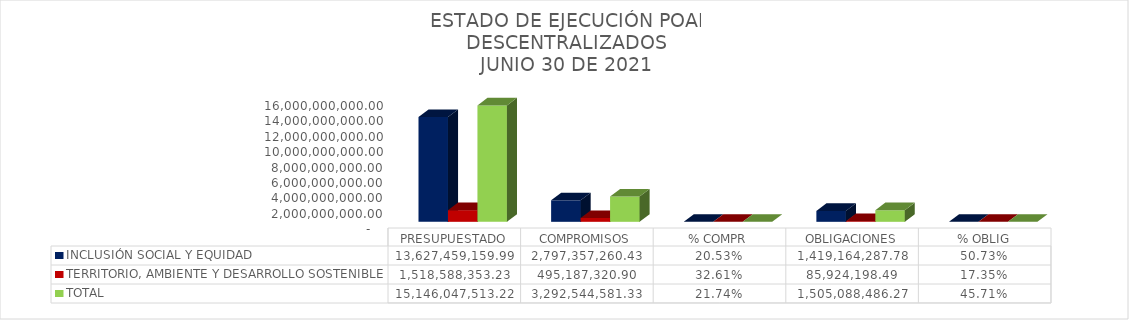
| Category | INCLUSIÓN SOCIAL Y EQUIDAD  | TERRITORIO, AMBIENTE Y DESARROLLO SOSTENIBLE  | TOTAL |
|---|---|---|---|
| PRESUPUESTADO | 13627459159.99 | 1518588353.23 | 15146047513.22 |
| COMPROMISOS | 2797357260.43 | 495187320.9 | 3292544581.33 |
| % COMPR | 0.205 | 0.326 | 0.217 |
| OBLIGACIONES | 1419164287.78 | 85924198.49 | 1505088486.27 |
| % OBLIG | 0.507 | 0.174 | 0.457 |